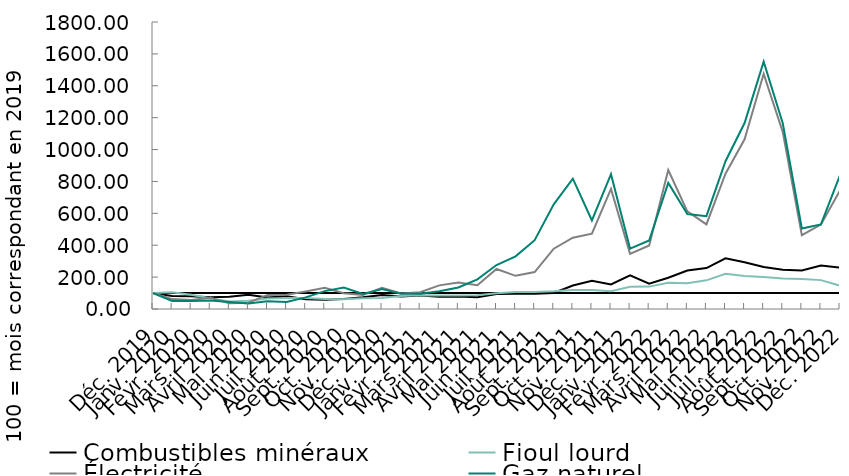
| Category | Series 4 | Combustibles minéraux | Fioul lourd | Électricité | Gaz naturel |
|---|---|---|---|---|---|
| Déc. 2019 | 100 | 100 | 100 | 100 | 100 |
| Janv. 2020 | 100 | 82.199 | 104.838 | 62.159 | 50.708 |
| Févr. 2020 | 100 | 79.917 | 88.701 | 56.306 | 50.496 |
| Mars 2020 | 100 | 73.708 | 67.194 | 70.34 | 53.499 |
| Avril 2020 | 100 | 77.47 | 47.293 | 35.32 | 43.162 |
| Mai 2020 | 100 | 89.029 | 51.028 | 39.936 | 34.309 |
| Juin 2020 | 100 | 71.802 | 65.356 | 88.141 | 48.56 |
| Juil 2020 | 100 | 79.162 | 69.131 | 88.715 | 43.721 |
| Août 2020 | 100 | 61.013 | 69.141 | 110.063 | 72.915 |
| Sept. 2020 | 100 | 57.907 | 62.831 | 132.808 | 112.029 |
| Oct. 2020 | 100 | 62.47 | 61.676 | 98.705 | 134.341 |
| Nov. 2020 | 100 | 73.072 | 66.69 | 87.31 | 93.767 |
| Déc. 2020 | 100 | 88.387 | 69.471 | 132.803 | 125.328 |
| Janv. 2021 | 100 | 77.92 | 81.879 | 97.269 | 95.203 |
| Févr. 2021 | 100 | 84.096 | 85.723 | 105.127 | 95.209 |
| Mars 2021 | 100 | 76.901 | 84.093 | 148.242 | 110.878 |
| Avril 2021 | 100 | 77.751 | 84.184 | 165.704 | 134.823 |
| Mai 2021 | 100 | 73.925 | 86.275 | 148.562 | 185.961 |
| Juin 2021 | 100 | 93.986 | 98.581 | 251.23 | 275.816 |
| Juil 2021 | 100 | 94.986 | 107.318 | 208.099 | 330.339 |
| Août 2021 | 100 | 95.971 | 106.475 | 231.506 | 431.698 |
| Sept. 2021 | 100 | 100.955 | 110.681 | 378.25 | 656.381 |
| Oct. 2021 | 100 | 147.439 | 119.285 | 446.957 | 817.561 |
| Nov. 2021 | 100 | 176.706 | 119.556 | 472.486 | 555.822 |
| Déc. 2021 | 100 | 153.77 | 111.559 | 753.346 | 845.637 |
| Janv. 2022 | 100 | 211.602 | 139.063 | 345.74 | 378.072 |
| Févr. 2022 | 100 | 158.199 | 140.444 | 398.005 | 429.35 |
| Mars 2022 | 100 | 195.927 | 164.467 | 871.758 | 791.158 |
| Avril 2022 | 100 | 241.134 | 162.251 | 612.132 | 596.131 |
| Mai 2022 | 100 | 256.884 | 179.65 | 530.583 | 582.432 |
| Juin 2022 | 100 | 317.644 | 220.64 | 848.941 | 926.775 |
| Juil. 2022 | 100 | 292.906 | 207.683 | 1064.445 | 1166.269 |
| Août 2022 | 100 | 262.887 | 201.003 | 1474.963 | 1551.325 |
| Sept. 2022 | 100 | 246.409 | 190.616 | 1110.58 | 1165.272 |
| Oct. 2022 | 100 | 241.362 | 188.398 | 463.533 | 504.585 |
| Nov. 2022 | 100 | 272.043 | 181.118 | 529.887 | 530.89 |
| Déc. 2022 | 100 | 260.275 | 146.12 | 742.979 | 839.151 |